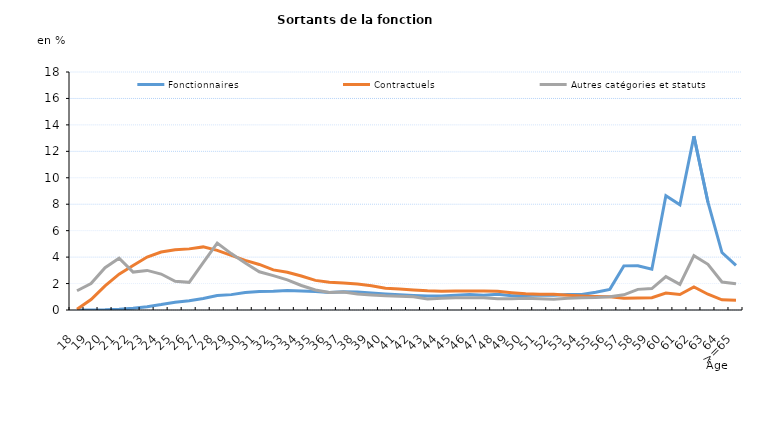
| Category | Fonctionnaires | Contractuels | Autres catégories et statuts |
|---|---|---|---|
| 18 | 0 | 0.057 | 1.456 |
| 19 | 0.001 | 0.791 | 2.004 |
| 20 | 0.018 | 1.828 | 3.202 |
| 21 | 0.06 | 2.709 | 3.912 |
| 22 | 0.141 | 3.369 | 2.866 |
| 23 | 0.254 | 4.005 | 2.994 |
| 24 | 0.409 | 4.383 | 2.719 |
| 25 | 0.588 | 4.548 | 2.169 |
| 26 | 0.696 | 4.623 | 2.093 |
| 27 | 0.87 | 4.772 | 3.589 |
| 28 | 1.089 | 4.509 | 5.058 |
| 29 | 1.162 | 4.131 | 4.265 |
| 30 | 1.316 | 3.756 | 3.552 |
| 31 | 1.407 | 3.444 | 2.892 |
| 32 | 1.411 | 3.033 | 2.602 |
| 33 | 1.466 | 2.855 | 2.278 |
| 34 | 1.439 | 2.575 | 1.853 |
| 35 | 1.395 | 2.239 | 1.519 |
| 36 | 1.319 | 2.097 | 1.326 |
| 37 | 1.382 | 2.044 | 1.365 |
| 38 | 1.356 | 1.96 | 1.214 |
| 39 | 1.281 | 1.84 | 1.138 |
| 40 | 1.211 | 1.648 | 1.073 |
| 41 | 1.153 | 1.586 | 1.036 |
| 42 | 1.104 | 1.511 | 0.994 |
| 43 | 1.056 | 1.447 | 0.835 |
| 44 | 1.055 | 1.422 | 0.89 |
| 45 | 1.108 | 1.446 | 0.924 |
| 46 | 1.166 | 1.439 | 0.921 |
| 47 | 1.11 | 1.434 | 0.924 |
| 48 | 1.199 | 1.412 | 0.846 |
| 49 | 1.085 | 1.313 | 0.856 |
| 50 | 1.09 | 1.228 | 0.885 |
| 51 | 1.134 | 1.187 | 0.843 |
| 52 | 1.121 | 1.184 | 0.814 |
| 53 | 1.164 | 1.118 | 0.885 |
| 54 | 1.175 | 1.067 | 0.927 |
| 55 | 1.337 | 1.027 | 0.942 |
| 56 | 1.561 | 0.997 | 1.005 |
| 57 | 3.338 | 0.889 | 1.146 |
| 58 | 3.351 | 0.913 | 1.561 |
| 59 | 3.083 | 0.927 | 1.621 |
| 60 | 8.641 | 1.278 | 2.521 |
| 61 | 7.952 | 1.172 | 1.939 |
| 62 | 13.146 | 1.748 | 4.113 |
| 63 | 8.152 | 1.194 | 3.458 |
| 64 | 4.346 | 0.77 | 2.119 |
| >=65 | 3.37 | 0.735 | 1.978 |